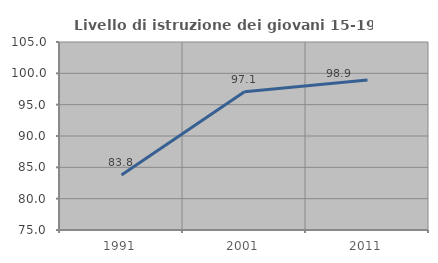
| Category | Livello di istruzione dei giovani 15-19 anni |
|---|---|
| 1991.0 | 83.789 |
| 2001.0 | 97.064 |
| 2011.0 | 98.925 |